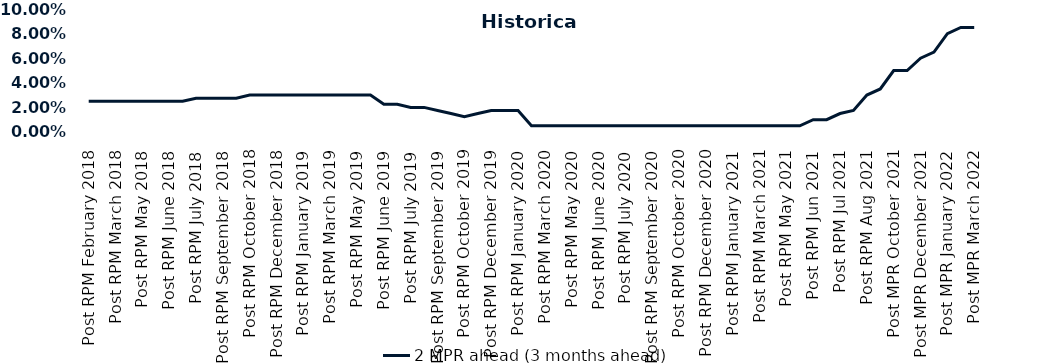
| Category | 2 MPR ahead (3 months ahead) |
|---|---|
| Post RPM February 2018 | 0.025 |
| Pre RPM March 2018 | 0.025 |
| Post RPM March 2018 | 0.025 |
| Pre RPM May 2018 | 0.025 |
| Post RPM May 2018 | 0.025 |
| Pre RPM June 2018 | 0.025 |
| Post RPM June 2018 | 0.025 |
| Pre RPM July 2018 | 0.025 |
| Post RPM July 2018 | 0.028 |
| Pre RPM September 2018 | 0.028 |
| Post RPM September 2018 | 0.028 |
| Pre RPM October 2018 | 0.028 |
| Post RPM October 2018 | 0.03 |
| Pre RPM December 2018 | 0.03 |
| Post RPM December 2018 | 0.03 |
| Pre RPM January 2019 | 0.03 |
| Post RPM January 2019 | 0.03 |
| Pre RPM March 2019 | 0.03 |
| Post RPM March 2019 | 0.03 |
| Pre RPM May 2019 | 0.03 |
| Post RPM May 2019 | 0.03 |
| Pre RPM June 2019 | 0.03 |
| Post RPM June 2019 | 0.022 |
| Pre RPM July 2019 | 0.022 |
| Post RPM July 2019 | 0.02 |
| Pre RPM September 2019 | 0.02 |
| Post RPM September 2019 | 0.018 |
| Pre RPM October 2019 | 0.015 |
| Post RPM October 2019 | 0.012 |
| Pre RPM December 2019 | 0.015 |
| Post RPM December 2019 | 0.018 |
| Pre RPM January 2020 | 0.018 |
| Post RPM January 2020 | 0.018 |
| Pre RPM March 2020 | 0.005 |
| Post RPM March 2020 | 0.005 |
| Pre RPM May 2020 | 0.005 |
| Post RPM May 2020 | 0.005 |
| Pre RPM June 2020 | 0.005 |
| Post RPM June 2020 | 0.005 |
| Pre RPM July 2020 | 0.005 |
| Post RPM July 2020 | 0.005 |
| Pre RPM September 2020 | 0.005 |
| Post RPM September 2020 | 0.005 |
| Pre RPM October 2020 | 0.005 |
| Post RPM October 2020 | 0.005 |
| Pre RPM December 2020 | 0.005 |
|  Post RPM December 2020 | 0.005 |
| Pre RPM January 2021 | 0.005 |
| Post RPM January 2021 | 0.005 |
|  Pre RPM March 2021 | 0.005 |
|  Post RPM March 2021 | 0.005 |
|  Pre RPM May 2021 | 0.005 |
|  Post RPM May 2021 | 0.005 |
|  Pre RPM Jun 2021 | 0.005 |
|   Post RPM Jun 2021 | 0.01 |
| Pre RPM Jul 2021 | 0.01 |
|  Post RPM Jul 2021 | 0.015 |
| Pre RPM Aug 2021 | 0.018 |
|  Post RPM Aug 2021 | 0.03 |
| Pre MPR October 2021 | 0.035 |
| Post MPR October 2021 | 0.05 |
| Pre MPR December 2021 | 0.05 |
| Post MPR December 2021 | 0.06 |
| Pre MPR January 2022 | 0.065 |
| Post MPR January 2022 | 0.08 |
| Pre MPR March 2022 | 0.085 |
| Post MPR March 2022 | 0.085 |